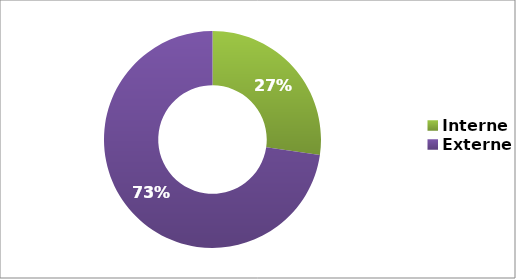
| Category | Series 0 |
|---|---|
| Interne | 0.273 |
| Externe | 0.727 |